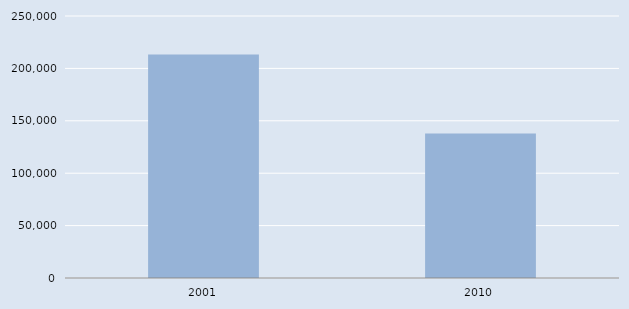
| Category | Series 0 |
|---|---|
| 2001.0 | 213203 |
| 2010.0 | 137973 |